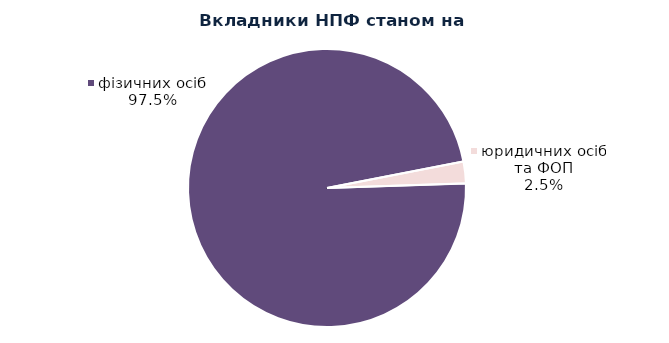
| Category | Series 0 |
|---|---|
| юридичних осіб та ФОП | 2059 |
| фізичних осіб | 79358 |